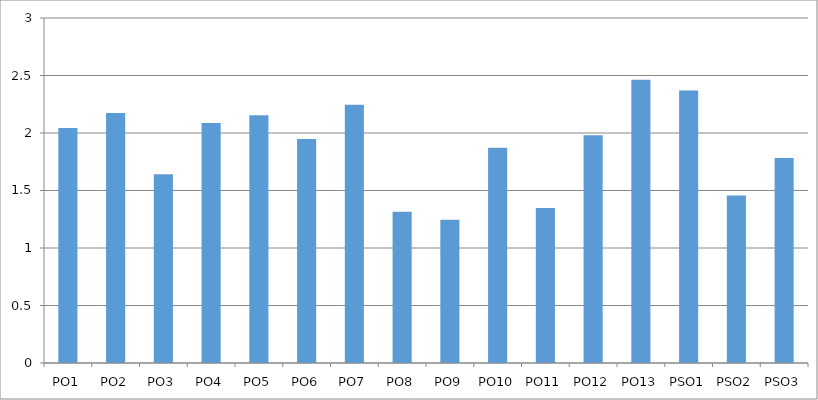
| Category | Series 0 |
|---|---|
| PO1 | 2.044 |
| PO2 | 2.174 |
| PO3 | 1.641 |
| PO4 | 2.087 |
| PO5 | 2.153 |
| PO6 | 1.948 |
| PO7 | 2.245 |
| PO8 | 1.315 |
| PO9 | 1.247 |
| PO10 | 1.871 |
| PO11 | 1.348 |
| PO12 | 1.981 |
| PO13 | 2.462 |
| PSO1 | 2.369 |
| PSO2 | 1.457 |
| PSO3 | 1.783 |